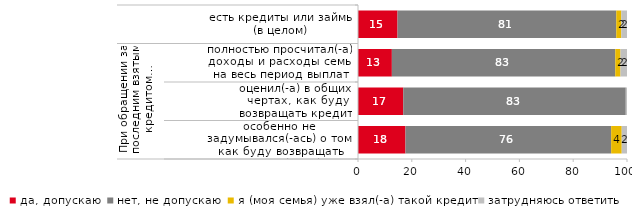
| Category | да, допускаю | нет, не допускаю | я (моя семья) уже взял(-а) такой кредит | затрудняюсь ответить |
|---|---|---|---|---|
| 0 | 14.695 | 81.32 | 1.868 | 2.117 |
| 1 | 12.591 | 83.051 | 1.937 | 2.421 |
| 2 | 16.818 | 82.727 | 0 | 0.455 |
| 3 | 17.647 | 76.471 | 3.922 | 1.961 |